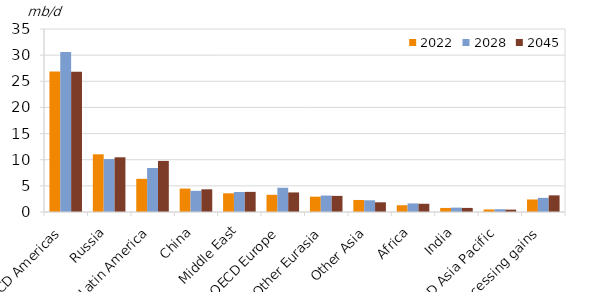
| Category | 2022 | 2028 | 2045 |
|---|---|---|---|
| OECD Americas | 26.865 | 30.59 | 26.847 |
| Russia | 11.033 | 10.126 | 10.464 |
| Latin America | 6.338 | 8.412 | 9.769 |
| China | 4.479 | 4.049 | 4.34 |
| Middle East | 3.575 | 3.829 | 3.849 |
| OECD Europe | 3.287 | 4.634 | 3.742 |
| Other Eurasia | 2.936 | 3.144 | 3.082 |
| Other Asia | 2.303 | 2.238 | 1.854 |
| Africa | 1.294 | 1.641 | 1.574 |
| India | 0.774 | 0.836 | 0.781 |
| OECD Asia Pacific | 0.48 | 0.53 | 0.452 |
| Processing gains | 2.399 | 2.707 | 3.184 |